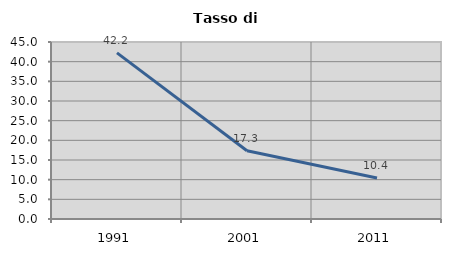
| Category | Tasso di disoccupazione   |
|---|---|
| 1991.0 | 42.248 |
| 2001.0 | 17.337 |
| 2011.0 | 10.443 |